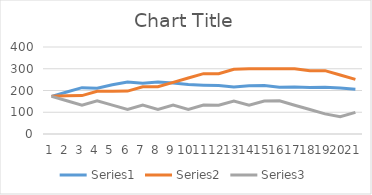
| Category | Series 0 | Series 1 | Series 2 |
|---|---|---|---|
| 0 | 173 | 173 | 173 |
| 1 | 193 | 175.423 | 153 |
| 2 | 213 | 176.633 | 133 |
| 3 | 210.502 | 196.633 | 153 |
| 4 | 226.097 | 197.012 | 133 |
| 5 | 239.349 | 197.348 | 113 |
| 6 | 233.687 | 217.348 | 133 |
| 7 | 239.068 | 217.348 | 113 |
| 8 | 234.95 | 237.348 | 133 |
| 9 | 227.751 | 257.348 | 113 |
| 10 | 224.404 | 277.348 | 133 |
| 11 | 222.5 | 277.337 | 131.988 |
| 12 | 216.106 | 297.337 | 151.988 |
| 13 | 222.13 | 300 | 131.988 |
| 14 | 222.607 | 300 | 151.988 |
| 15 | 215.416 | 299.722 | 152.357 |
| 16 | 216.185 | 300 | 132.357 |
| 17 | 213.387 | 291.35 | 112.357 |
| 18 | 214.866 | 291.35 | 92.357 |
| 19 | 211.418 | 271.35 | 79.43 |
| 20 | 206.288 | 251.35 | 99.43 |